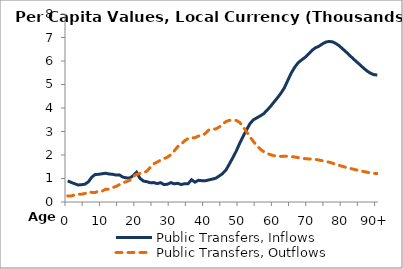
| Category | Public Transfers, Inflows | Public Transfers, Outflows |
|---|---|---|
| 0 | 898.654 | 259.314 |
|  | 834.168 | 257.535 |
| 2 | 778.945 | 300.997 |
| 3 | 725.634 | 330.764 |
| 4 | 735.461 | 329.407 |
| 5 | 757.26 | 360.799 |
| 6 | 857.15 | 431.444 |
| 7 | 1058.429 | 409.52 |
| 8 | 1171.699 | 404.258 |
| 9 | 1177.576 | 469.795 |
| 10 | 1201.85 | 462.175 |
| 11 | 1225.017 | 541.068 |
| 12 | 1192.076 | 541.977 |
| 13 | 1179.41 | 612.39 |
| 14 | 1146.792 | 659.462 |
| 15 | 1154.313 | 737.308 |
| 16 | 1061.526 | 817.595 |
| 17 | 1027.74 | 862.171 |
| 18 | 1019.302 | 924.256 |
| 19 | 1116.037 | 1091.339 |
| 20 | 1268.949 | 1168.69 |
| 21 | 1009.002 | 1217.711 |
| 22 | 891.689 | 1245.119 |
| 23 | 865.49 | 1309.837 |
| 24 | 818.99 | 1472.337 |
| 25 | 826.043 | 1622.034 |
| 26 | 782.407 | 1697.597 |
| 27 | 823.482 | 1782.765 |
| 28 | 740.847 | 1845.722 |
| 29 | 757.068 | 1907.858 |
| 30 | 824.408 | 2011.037 |
| 31 | 774.399 | 2179.476 |
| 32 | 794.284 | 2358.548 |
| 33 | 743.932 | 2454.895 |
| 34 | 778.601 | 2603.639 |
| 35 | 778.605 | 2702.976 |
| 36 | 947.78 | 2730.692 |
| 37 | 843.844 | 2736.01 |
| 38 | 922.735 | 2806.348 |
| 39 | 907.461 | 2817.257 |
| 40 | 904.119 | 2914.687 |
| 41 | 939.175 | 3059.573 |
| 42 | 971.324 | 3101.2 |
| 43 | 1010.196 | 3106.192 |
| 44 | 1101.645 | 3186.253 |
| 45 | 1206.041 | 3303.139 |
| 46 | 1361.484 | 3422.478 |
| 47 | 1617.865 | 3474.513 |
| 48 | 1885.07 | 3468.327 |
| 49 | 2168.706 | 3471.958 |
| 50 | 2497.877 | 3387.208 |
| 51 | 2796.107 | 3198.733 |
| 52 | 3072.809 | 2984.04 |
| 53 | 3337.898 | 2765.948 |
| 54 | 3499.525 | 2573.158 |
| 55 | 3583.66 | 2395.3 |
| 56 | 3663.654 | 2246.65 |
| 57 | 3760.737 | 2139.086 |
| 58 | 3910.675 | 2064.322 |
| 59 | 4075.813 | 2009.169 |
| 60 | 4258.313 | 1966.841 |
| 61 | 4439.544 | 1948.401 |
| 62 | 4632.739 | 1940.013 |
| 63 | 4861.452 | 1950.717 |
| 64 | 5180.111 | 1945.166 |
| 65 | 5490.639 | 1930.884 |
| 66 | 5735.593 | 1914.384 |
| 67 | 5927.22 | 1888.49 |
| 68 | 6046.12 | 1864.683 |
| 69 | 6155.542 | 1844.264 |
| 70 | 6293.852 | 1833.654 |
| 71 | 6448.108 | 1829.361 |
| 72 | 6561.398 | 1811.092 |
| 73 | 6623.373 | 1787.657 |
| 74 | 6723.152 | 1757.772 |
| 75 | 6802.32 | 1729.245 |
| 76 | 6833.169 | 1694.503 |
| 77 | 6813.959 | 1649.972 |
| 78 | 6739.919 | 1602.238 |
| 79 | 6639.783 | 1555.338 |
| 80 | 6508.048 | 1511.744 |
| 81 | 6374.844 | 1470.108 |
| 82 | 6235.017 | 1433.755 |
| 83 | 6096.932 | 1397.739 |
| 84 | 5963.191 | 1362.747 |
| 85 | 5835.356 | 1330.221 |
| 86 | 5699.377 | 1298.055 |
| 87 | 5578.165 | 1266.829 |
| 88 | 5482.292 | 1240.516 |
| 89 | 5417.211 | 1216.084 |
| 90+ | 5404.248 | 1212.6 |